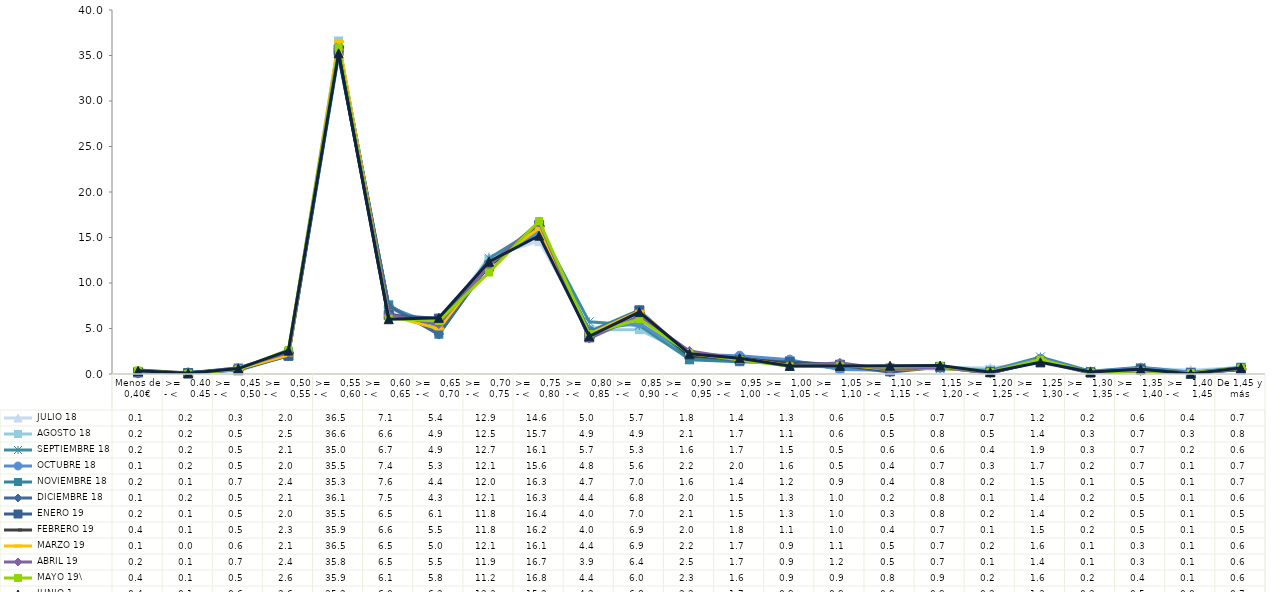
| Category |  JULIO 18 |  AGOSTO 18 |  SEPTIEMBRE 18 |  OCTUBRE 18 |  NOVIEMBRE 18 |  DICIEMBRE 18 |  ENERO 19 |  FEBRERO 19 |  MARZO 19 |  ABRIL 19 |  MAYO 19\ |  JUNIO 1 |
|---|---|---|---|---|---|---|---|---|---|---|---|---|
| Menos de 0,40€ | 0.12 | 0.15 | 0.17 | 0.08 | 0.16 | 0.07 | 0.2 | 0.44 | 0.13 | 0.18 | 0.39 | 0.35 |
| >=   0.40 - <    0.45 | 0.22 | 0.15 | 0.15 | 0.15 | 0.14 | 0.18 | 0.08 | 0.12 | 0.03 | 0.06 | 0.05 | 0.07 |
| >=   0,45 - <    0,50 | 0.33 | 0.47 | 0.45 | 0.53 | 0.66 | 0.47 | 0.46 | 0.52 | 0.56 | 0.68 | 0.52 | 0.6 |
| >=   0,50 - <    0,55 | 2.02 | 2.48 | 2.09 | 2.02 | 2.35 | 2.08 | 2 | 2.28 | 2.09 | 2.36 | 2.64 | 2.57 |
| >=   0,55 - <    0,60 | 36.45 | 36.59 | 34.99 | 35.48 | 35.27 | 36.11 | 35.5 | 35.91 | 36.53 | 35.75 | 35.85 | 35.24 |
| >=   0,60 - <    0,65 | 7.09 | 6.6 | 6.71 | 7.36 | 7.6 | 7.48 | 6.48 | 6.55 | 6.45 | 6.51 | 6.08 | 6.02 |
| >=   0,65 - <   0,70 | 5.43 | 4.89 | 4.94 | 5.26 | 4.37 | 4.33 | 6.09 | 5.48 | 4.96 | 5.48 | 5.82 | 6.17 |
| >=   0,70 - <   0,75 | 12.87 | 12.53 | 12.72 | 12.06 | 12.03 | 12.14 | 11.8 | 11.8 | 12.07 | 11.94 | 11.15 | 12.34 |
| >=   0,75 - <   0,80 | 14.6 | 15.68 | 16.11 | 15.63 | 16.31 | 16.26 | 16.37 | 16.24 | 16.05 | 16.66 | 16.82 | 15.2 |
| >=   0,80 - <   0,85 | 5.02 | 4.85 | 5.73 | 4.81 | 4.65 | 4.4 | 4.02 | 4.03 | 4.37 | 3.89 | 4.39 | 4.15 |
| >=   0,85 - <   0,90 | 5.66 | 4.87 | 5.34 | 5.57 | 7.04 | 6.84 | 6.98 | 6.85 | 6.9 | 6.39 | 6.03 | 6.8 |
| >=   0,90 - <    0,95 | 1.79 | 2.1 | 1.62 | 2.15 | 1.56 | 2.04 | 2.1 | 1.96 | 2.19 | 2.54 | 2.29 | 2.23 |
| >=   0,95 - <   1,00 | 1.43 | 1.74 | 1.68 | 2.01 | 1.35 | 1.45 | 1.54 | 1.76 | 1.7 | 1.69 | 1.55 | 1.73 |
| >=   1,00 - <   1,05 | 1.3 | 1.1 | 1.47 | 1.58 | 1.18 | 1.33 | 1.31 | 1.14 | 0.93 | 0.88 | 0.85 | 0.89 |
| >=   1,05 - <    1,10 | 0.63 | 0.64 | 0.52 | 0.5 | 0.9 | 0.95 | 1.02 | 1.01 | 1.08 | 1.24 | 0.86 | 0.89 |
| >=   1,10 - <   1,15 | 0.45 | 0.48 | 0.64 | 0.42 | 0.44 | 0.18 | 0.29 | 0.42 | 0.48 | 0.46 | 0.78 | 0.9 |
| >=   1,15 - <    1,20 | 0.7 | 0.82 | 0.57 | 0.71 | 0.79 | 0.78 | 0.79 | 0.71 | 0.66 | 0.73 | 0.86 | 0.93 |
| >=   1,20 - <    1,25 | 0.69 | 0.46 | 0.38 | 0.3 | 0.23 | 0.09 | 0.2 | 0.12 | 0.19 | 0.11 | 0.21 | 0.2 |
| >=   1,25 - <    1,30 | 1.24 | 1.43 | 1.87 | 1.68 | 1.5 | 1.43 | 1.43 | 1.46 | 1.55 | 1.41 | 1.55 | 1.29 |
| >=   1,30 - <    1,35 | 0.2 | 0.28 | 0.31 | 0.21 | 0.1 | 0.15 | 0.18 | 0.18 | 0.11 | 0.09 | 0.17 | 0.22 |
| >=   1,35 - <    1,40 | 0.63 | 0.68 | 0.73 | 0.68 | 0.5 | 0.45 | 0.53 | 0.46 | 0.3 | 0.33 | 0.36 | 0.52 |
| >=   1,40 - <    1,45 | 0.43 | 0.25 | 0.18 | 0.14 | 0.11 | 0.12 | 0.08 | 0.06 | 0.07 | 0.06 | 0.11 | 0.03 |
| De 1,45 y más | 0.68 | 0.76 | 0.61 | 0.67 | 0.72 | 0.63 | 0.5 | 0.49 | 0.57 | 0.56 | 0.64 | 0.66 |